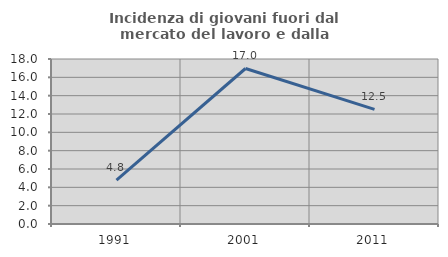
| Category | Incidenza di giovani fuori dal mercato del lavoro e dalla formazione  |
|---|---|
| 1991.0 | 4.787 |
| 2001.0 | 16.964 |
| 2011.0 | 12.5 |